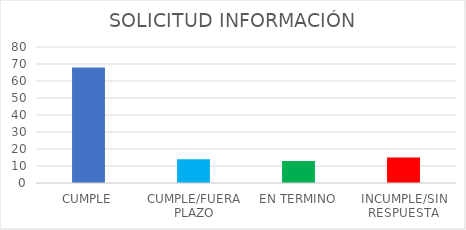
| Category | Series 0 |
|---|---|
| CUMPLE | 68 |
| CUMPLE/FUERA PLAZO | 14 |
| EN TERMINO | 13 |
| INCUMPLE/SIN RESPUESTA | 15 |